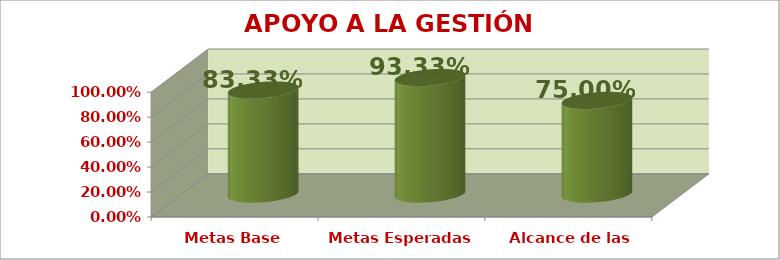
| Category | APOYO A LA GESTIÓN ACADÉMICA |
|---|---|
| Metas Base | 0.833 |
| Metas Esperadas | 0.933 |
| Alcance de las Metas | 0.75 |